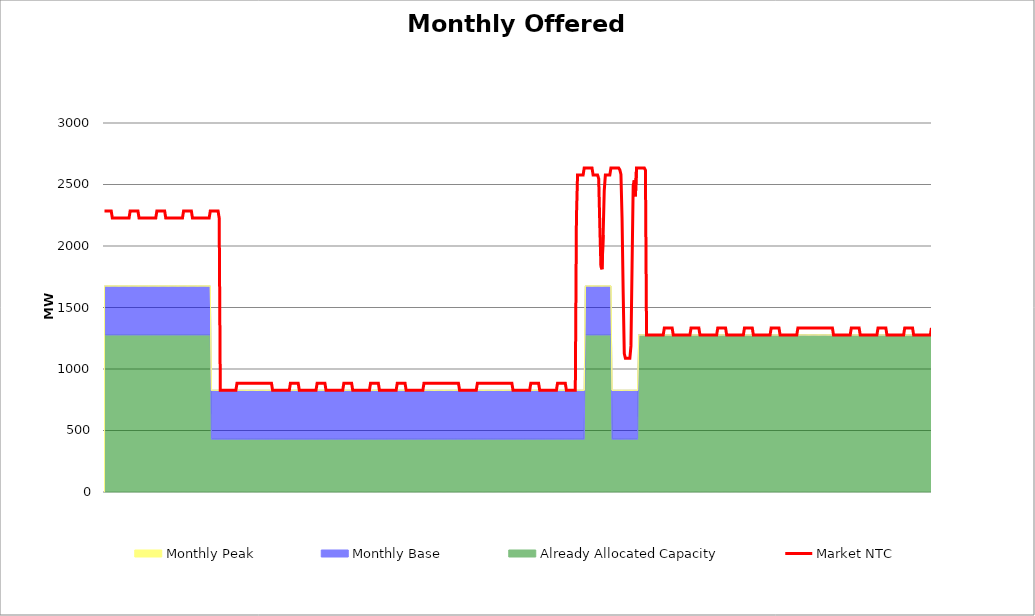
| Category | Market NTC |
|---|---|
| 0 | 2284 |
| 1 | 2284 |
| 2 | 2284 |
| 3 | 2284 |
| 4 | 2284 |
| 5 | 2284 |
| 6 | 2284 |
| 7 | 2227 |
| 8 | 2227 |
| 9 | 2227 |
| 10 | 2227 |
| 11 | 2227 |
| 12 | 2227 |
| 13 | 2227 |
| 14 | 2227 |
| 15 | 2227 |
| 16 | 2227 |
| 17 | 2227 |
| 18 | 2227 |
| 19 | 2227 |
| 20 | 2227 |
| 21 | 2227 |
| 22 | 2227 |
| 23 | 2284 |
| 24 | 2284 |
| 25 | 2284 |
| 26 | 2284 |
| 27 | 2284 |
| 28 | 2284 |
| 29 | 2284 |
| 30 | 2284 |
| 31 | 2227 |
| 32 | 2227 |
| 33 | 2227 |
| 34 | 2227 |
| 35 | 2227 |
| 36 | 2227 |
| 37 | 2227 |
| 38 | 2227 |
| 39 | 2227 |
| 40 | 2227 |
| 41 | 2227 |
| 42 | 2227 |
| 43 | 2227 |
| 44 | 2227 |
| 45 | 2227 |
| 46 | 2227 |
| 47 | 2284 |
| 48 | 2284 |
| 49 | 2284 |
| 50 | 2284 |
| 51 | 2284 |
| 52 | 2284 |
| 53 | 2284 |
| 54 | 2284 |
| 55 | 2227 |
| 56 | 2227 |
| 57 | 2227 |
| 58 | 2227 |
| 59 | 2227 |
| 60 | 2227 |
| 61 | 2227 |
| 62 | 2227 |
| 63 | 2227 |
| 64 | 2227 |
| 65 | 2227 |
| 66 | 2227 |
| 67 | 2227 |
| 68 | 2227 |
| 69 | 2227 |
| 70 | 2227 |
| 71 | 2284 |
| 72 | 2284 |
| 73 | 2284 |
| 74 | 2284 |
| 75 | 2284 |
| 76 | 2284 |
| 77 | 2284 |
| 78 | 2284 |
| 79 | 2227 |
| 80 | 2227 |
| 81 | 2227 |
| 82 | 2227 |
| 83 | 2227 |
| 84 | 2227 |
| 85 | 2227 |
| 86 | 2227 |
| 87 | 2227 |
| 88 | 2227 |
| 89 | 2227 |
| 90 | 2227 |
| 91 | 2227 |
| 92 | 2227 |
| 93 | 2227 |
| 94 | 2227 |
| 95 | 2284 |
| 96 | 2284 |
| 97 | 2284 |
| 98 | 2284 |
| 99 | 2284 |
| 100 | 2284 |
| 101 | 2284 |
| 102 | 2284 |
| 103 | 2227 |
| 104 | 827 |
| 105 | 827 |
| 106 | 827 |
| 107 | 827 |
| 108 | 827 |
| 109 | 827 |
| 110 | 827 |
| 111 | 827 |
| 112 | 827 |
| 113 | 827 |
| 114 | 827 |
| 115 | 827 |
| 116 | 827 |
| 117 | 827 |
| 118 | 827 |
| 119 | 884 |
| 120 | 884 |
| 121 | 884 |
| 122 | 884 |
| 123 | 884 |
| 124 | 884 |
| 125 | 884 |
| 126 | 884 |
| 127 | 884 |
| 128 | 884 |
| 129 | 884 |
| 130 | 884 |
| 131 | 884 |
| 132 | 884 |
| 133 | 884 |
| 134 | 884 |
| 135 | 884 |
| 136 | 884 |
| 137 | 884 |
| 138 | 884 |
| 139 | 884 |
| 140 | 884 |
| 141 | 884 |
| 142 | 884 |
| 143 | 884 |
| 144 | 884 |
| 145 | 884 |
| 146 | 884 |
| 147 | 884 |
| 148 | 884 |
| 149 | 884 |
| 150 | 884 |
| 151 | 827 |
| 152 | 827 |
| 153 | 827 |
| 154 | 827 |
| 155 | 827 |
| 156 | 827 |
| 157 | 827 |
| 158 | 827 |
| 159 | 827 |
| 160 | 827 |
| 161 | 827 |
| 162 | 827 |
| 163 | 827 |
| 164 | 827 |
| 165 | 827 |
| 166 | 827 |
| 167 | 884 |
| 168 | 884 |
| 169 | 884 |
| 170 | 884 |
| 171 | 884 |
| 172 | 884 |
| 173 | 884 |
| 174 | 884 |
| 175 | 827 |
| 176 | 827 |
| 177 | 827 |
| 178 | 827 |
| 179 | 827 |
| 180 | 827 |
| 181 | 827 |
| 182 | 827 |
| 183 | 827 |
| 184 | 827 |
| 185 | 827 |
| 186 | 827 |
| 187 | 827 |
| 188 | 827 |
| 189 | 827 |
| 190 | 827 |
| 191 | 884 |
| 192 | 884 |
| 193 | 884 |
| 194 | 884 |
| 195 | 884 |
| 196 | 884 |
| 197 | 884 |
| 198 | 884 |
| 199 | 827 |
| 200 | 827 |
| 201 | 827 |
| 202 | 827 |
| 203 | 827 |
| 204 | 827 |
| 205 | 827 |
| 206 | 827 |
| 207 | 827 |
| 208 | 827 |
| 209 | 827 |
| 210 | 827 |
| 211 | 827 |
| 212 | 827 |
| 213 | 827 |
| 214 | 827 |
| 215 | 884 |
| 216 | 884 |
| 217 | 884 |
| 218 | 884 |
| 219 | 884 |
| 220 | 884 |
| 221 | 884 |
| 222 | 884 |
| 223 | 827 |
| 224 | 827 |
| 225 | 827 |
| 226 | 827 |
| 227 | 827 |
| 228 | 827 |
| 229 | 827 |
| 230 | 827 |
| 231 | 827 |
| 232 | 827 |
| 233 | 827 |
| 234 | 827 |
| 235 | 827 |
| 236 | 827 |
| 237 | 827 |
| 238 | 827 |
| 239 | 884 |
| 240 | 884 |
| 241 | 884 |
| 242 | 884 |
| 243 | 884 |
| 244 | 884 |
| 245 | 884 |
| 246 | 884 |
| 247 | 827 |
| 248 | 827 |
| 249 | 827 |
| 250 | 827 |
| 251 | 827 |
| 252 | 827 |
| 253 | 827 |
| 254 | 827 |
| 255 | 827 |
| 256 | 827 |
| 257 | 827 |
| 258 | 827 |
| 259 | 827 |
| 260 | 827 |
| 261 | 827 |
| 262 | 827 |
| 263 | 884 |
| 264 | 884 |
| 265 | 884 |
| 266 | 884 |
| 267 | 884 |
| 268 | 884 |
| 269 | 884 |
| 270 | 884 |
| 271 | 827 |
| 272 | 827 |
| 273 | 827 |
| 274 | 827 |
| 275 | 827 |
| 276 | 827 |
| 277 | 827 |
| 278 | 827 |
| 279 | 827 |
| 280 | 827 |
| 281 | 827 |
| 282 | 827 |
| 283 | 827 |
| 284 | 827 |
| 285 | 827 |
| 286 | 827 |
| 287 | 884 |
| 288 | 884 |
| 289 | 884 |
| 290 | 884 |
| 291 | 884 |
| 292 | 884 |
| 293 | 884 |
| 294 | 884 |
| 295 | 884 |
| 296 | 884 |
| 297 | 884 |
| 298 | 884 |
| 299 | 884 |
| 300 | 884 |
| 301 | 884 |
| 302 | 884 |
| 303 | 884 |
| 304 | 884 |
| 305 | 884 |
| 306 | 884 |
| 307 | 884 |
| 308 | 884 |
| 309 | 884 |
| 310 | 884 |
| 311 | 884 |
| 312 | 884 |
| 313 | 884 |
| 314 | 884 |
| 315 | 884 |
| 316 | 884 |
| 317 | 884 |
| 318 | 884 |
| 319 | 827 |
| 320 | 827 |
| 321 | 827 |
| 322 | 827 |
| 323 | 827 |
| 324 | 827 |
| 325 | 827 |
| 326 | 827 |
| 327 | 827 |
| 328 | 827 |
| 329 | 827 |
| 330 | 827 |
| 331 | 827 |
| 332 | 827 |
| 333 | 827 |
| 334 | 827 |
| 335 | 884 |
| 336 | 884 |
| 337 | 884 |
| 338 | 884 |
| 339 | 884 |
| 340 | 884 |
| 341 | 884 |
| 342 | 884 |
| 343 | 884 |
| 344 | 884 |
| 345 | 884 |
| 346 | 884 |
| 347 | 884 |
| 348 | 884 |
| 349 | 884 |
| 350 | 884 |
| 351 | 884 |
| 352 | 884 |
| 353 | 884 |
| 354 | 884 |
| 355 | 884 |
| 356 | 884 |
| 357 | 884 |
| 358 | 884 |
| 359 | 884 |
| 360 | 884 |
| 361 | 884 |
| 362 | 884 |
| 363 | 884 |
| 364 | 884 |
| 365 | 884 |
| 366 | 884 |
| 367 | 827 |
| 368 | 827 |
| 369 | 827 |
| 370 | 827 |
| 371 | 827 |
| 372 | 827 |
| 373 | 827 |
| 374 | 827 |
| 375 | 827 |
| 376 | 827 |
| 377 | 827 |
| 378 | 827 |
| 379 | 827 |
| 380 | 827 |
| 381 | 827 |
| 382 | 827 |
| 383 | 884 |
| 384 | 884 |
| 385 | 884 |
| 386 | 884 |
| 387 | 884 |
| 388 | 884 |
| 389 | 884 |
| 390 | 884 |
| 391 | 827 |
| 392 | 827 |
| 393 | 827 |
| 394 | 827 |
| 395 | 827 |
| 396 | 827 |
| 397 | 827 |
| 398 | 827 |
| 399 | 827 |
| 400 | 827 |
| 401 | 827 |
| 402 | 827 |
| 403 | 827 |
| 404 | 827 |
| 405 | 827 |
| 406 | 827 |
| 407 | 884 |
| 408 | 884 |
| 409 | 884 |
| 410 | 884 |
| 411 | 884 |
| 412 | 884 |
| 413 | 884 |
| 414 | 884 |
| 415 | 827 |
| 416 | 827 |
| 417 | 827 |
| 418 | 827 |
| 419 | 827 |
| 420 | 827 |
| 421 | 827 |
| 422 | 827 |
| 423 | 827 |
| 424 | 2227 |
| 425 | 2577 |
| 426 | 2577 |
| 427 | 2577 |
| 428 | 2577 |
| 429 | 2577 |
| 430 | 2577 |
| 431 | 2634 |
| 432 | 2634 |
| 433 | 2634 |
| 434 | 2634 |
| 435 | 2634 |
| 436 | 2634 |
| 437 | 2634 |
| 438 | 2634 |
| 439 | 2577 |
| 440 | 2577 |
| 441 | 2577 |
| 442 | 2577 |
| 443 | 2577 |
| 444 | 2548 |
| 445 | 2171 |
| 446 | 1833 |
| 447 | 1811 |
| 448 | 2090 |
| 449 | 2451 |
| 450 | 2577 |
| 451 | 2577 |
| 452 | 2577 |
| 453 | 2577 |
| 454 | 2577 |
| 455 | 2634 |
| 456 | 2634 |
| 457 | 2634 |
| 458 | 2634 |
| 459 | 2634 |
| 460 | 2634 |
| 461 | 2634 |
| 462 | 2634 |
| 463 | 2619 |
| 464 | 2582 |
| 465 | 2225 |
| 466 | 1625 |
| 467 | 1126 |
| 468 | 1087 |
| 469 | 1087 |
| 470 | 1087 |
| 471 | 1087 |
| 472 | 1087 |
| 473 | 1188 |
| 474 | 1840 |
| 475 | 2492 |
| 476 | 2533 |
| 477 | 2404 |
| 478 | 2634 |
| 479 | 2634 |
| 480 | 2634 |
| 481 | 2634 |
| 482 | 2634 |
| 483 | 2634 |
| 484 | 2634 |
| 485 | 2634 |
| 486 | 2617 |
| 487 | 1277 |
| 488 | 1277 |
| 489 | 1277 |
| 490 | 1277 |
| 491 | 1277 |
| 492 | 1277 |
| 493 | 1277 |
| 494 | 1277 |
| 495 | 1277 |
| 496 | 1277 |
| 497 | 1277 |
| 498 | 1277 |
| 499 | 1277 |
| 500 | 1277 |
| 501 | 1277 |
| 502 | 1277 |
| 503 | 1334 |
| 504 | 1334 |
| 505 | 1334 |
| 506 | 1334 |
| 507 | 1334 |
| 508 | 1334 |
| 509 | 1334 |
| 510 | 1334 |
| 511 | 1277 |
| 512 | 1277 |
| 513 | 1277 |
| 514 | 1277 |
| 515 | 1277 |
| 516 | 1277 |
| 517 | 1277 |
| 518 | 1277 |
| 519 | 1277 |
| 520 | 1277 |
| 521 | 1277 |
| 522 | 1277 |
| 523 | 1277 |
| 524 | 1277 |
| 525 | 1277 |
| 526 | 1277 |
| 527 | 1334 |
| 528 | 1334 |
| 529 | 1334 |
| 530 | 1334 |
| 531 | 1334 |
| 532 | 1334 |
| 533 | 1334 |
| 534 | 1334 |
| 535 | 1277 |
| 536 | 1277 |
| 537 | 1277 |
| 538 | 1277 |
| 539 | 1277 |
| 540 | 1277 |
| 541 | 1277 |
| 542 | 1277 |
| 543 | 1277 |
| 544 | 1277 |
| 545 | 1277 |
| 546 | 1277 |
| 547 | 1277 |
| 548 | 1277 |
| 549 | 1277 |
| 550 | 1277 |
| 551 | 1334 |
| 552 | 1334 |
| 553 | 1334 |
| 554 | 1334 |
| 555 | 1334 |
| 556 | 1334 |
| 557 | 1334 |
| 558 | 1334 |
| 559 | 1277 |
| 560 | 1277 |
| 561 | 1277 |
| 562 | 1277 |
| 563 | 1277 |
| 564 | 1277 |
| 565 | 1277 |
| 566 | 1277 |
| 567 | 1277 |
| 568 | 1277 |
| 569 | 1277 |
| 570 | 1277 |
| 571 | 1277 |
| 572 | 1277 |
| 573 | 1277 |
| 574 | 1277 |
| 575 | 1334 |
| 576 | 1334 |
| 577 | 1334 |
| 578 | 1334 |
| 579 | 1334 |
| 580 | 1334 |
| 581 | 1334 |
| 582 | 1334 |
| 583 | 1277 |
| 584 | 1277 |
| 585 | 1277 |
| 586 | 1277 |
| 587 | 1277 |
| 588 | 1277 |
| 589 | 1277 |
| 590 | 1277 |
| 591 | 1277 |
| 592 | 1277 |
| 593 | 1277 |
| 594 | 1277 |
| 595 | 1277 |
| 596 | 1277 |
| 597 | 1277 |
| 598 | 1277 |
| 599 | 1334 |
| 600 | 1334 |
| 601 | 1334 |
| 602 | 1334 |
| 603 | 1334 |
| 604 | 1334 |
| 605 | 1334 |
| 606 | 1334 |
| 607 | 1277 |
| 608 | 1277 |
| 609 | 1277 |
| 610 | 1277 |
| 611 | 1277 |
| 612 | 1277 |
| 613 | 1277 |
| 614 | 1277 |
| 615 | 1277 |
| 616 | 1277 |
| 617 | 1277 |
| 618 | 1277 |
| 619 | 1277 |
| 620 | 1277 |
| 621 | 1277 |
| 622 | 1277 |
| 623 | 1334 |
| 624 | 1334 |
| 625 | 1334 |
| 626 | 1334 |
| 627 | 1334 |
| 628 | 1334 |
| 629 | 1334 |
| 630 | 1334 |
| 631 | 1334 |
| 632 | 1334 |
| 633 | 1334 |
| 634 | 1334 |
| 635 | 1334 |
| 636 | 1334 |
| 637 | 1334 |
| 638 | 1334 |
| 639 | 1334 |
| 640 | 1334 |
| 641 | 1334 |
| 642 | 1334 |
| 643 | 1334 |
| 644 | 1334 |
| 645 | 1334 |
| 646 | 1334 |
| 647 | 1334 |
| 648 | 1334 |
| 649 | 1334 |
| 650 | 1334 |
| 651 | 1334 |
| 652 | 1334 |
| 653 | 1334 |
| 654 | 1334 |
| 655 | 1277 |
| 656 | 1277 |
| 657 | 1277 |
| 658 | 1277 |
| 659 | 1277 |
| 660 | 1277 |
| 661 | 1277 |
| 662 | 1277 |
| 663 | 1277 |
| 664 | 1277 |
| 665 | 1277 |
| 666 | 1277 |
| 667 | 1277 |
| 668 | 1277 |
| 669 | 1277 |
| 670 | 1277 |
| 671 | 1334 |
| 672 | 1334 |
| 673 | 1334 |
| 674 | 1334 |
| 675 | 1334 |
| 676 | 1334 |
| 677 | 1334 |
| 678 | 1334 |
| 679 | 1277 |
| 680 | 1277 |
| 681 | 1277 |
| 682 | 1277 |
| 683 | 1277 |
| 684 | 1277 |
| 685 | 1277 |
| 686 | 1277 |
| 687 | 1277 |
| 688 | 1277 |
| 689 | 1277 |
| 690 | 1277 |
| 691 | 1277 |
| 692 | 1277 |
| 693 | 1277 |
| 694 | 1277 |
| 695 | 1334 |
| 696 | 1334 |
| 697 | 1334 |
| 698 | 1334 |
| 699 | 1334 |
| 700 | 1334 |
| 701 | 1334 |
| 702 | 1334 |
| 703 | 1277 |
| 704 | 1277 |
| 705 | 1277 |
| 706 | 1277 |
| 707 | 1277 |
| 708 | 1277 |
| 709 | 1277 |
| 710 | 1277 |
| 711 | 1277 |
| 712 | 1277 |
| 713 | 1277 |
| 714 | 1277 |
| 715 | 1277 |
| 716 | 1277 |
| 717 | 1277 |
| 718 | 1277 |
| 719 | 1334 |
| 720 | 1334 |
| 721 | 1334 |
| 722 | 1334 |
| 723 | 1334 |
| 724 | 1334 |
| 725 | 1334 |
| 726 | 1334 |
| 727 | 1277 |
| 728 | 1277 |
| 729 | 1277 |
| 730 | 1277 |
| 731 | 1277 |
| 732 | 1277 |
| 733 | 1277 |
| 734 | 1277 |
| 735 | 1277 |
| 736 | 1277 |
| 737 | 1277 |
| 738 | 1277 |
| 739 | 1277 |
| 740 | 1277 |
| 741 | 1277 |
| 742 | 1277 |
| 743 | 1334 |